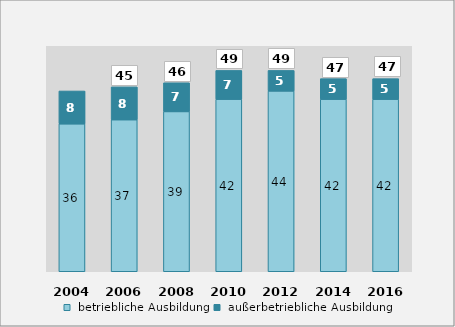
| Category |  betriebliche Ausbildung |  außerbetriebliche Ausbildung |
|---|---|---|
| 2004.0 | 36 | 8 |
| 2006.0 | 37 | 8 |
| 2008.0 | 39 | 7 |
| 2010.0 | 42 | 7 |
| 2012.0 | 44 | 5 |
| 2014.0 | 42 | 5 |
| 2016.0 | 42 | 5 |